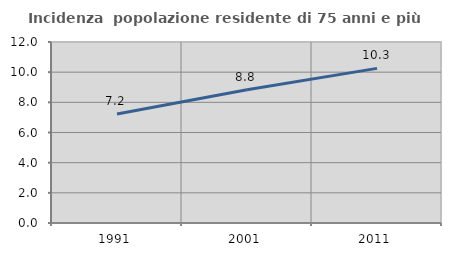
| Category | Incidenza  popolazione residente di 75 anni e più |
|---|---|
| 1991.0 | 7.23 |
| 2001.0 | 8.837 |
| 2011.0 | 10.252 |